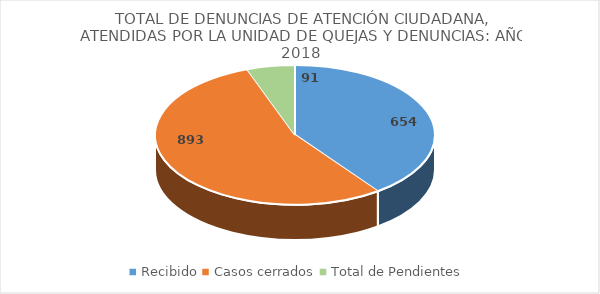
| Category | Series 0 |
|---|---|
| Recibido | 654 |
| Casos cerrados | 893 |
| Total de Pendientes | 91 |